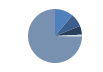
| Category | Series 0 |
|---|---|
| ARRASTRE | 101 |
| CERCO | 72 |
| PALANGRE | 48 |
| REDES DE ENMALLE | 7 |
| ARTES FIJAS | 5 |
| ARTES MENORES | 680 |